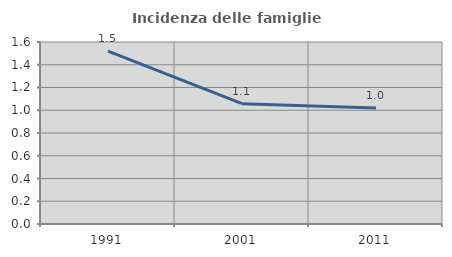
| Category | Incidenza delle famiglie numerose |
|---|---|
| 1991.0 | 1.52 |
| 2001.0 | 1.058 |
| 2011.0 | 1.019 |